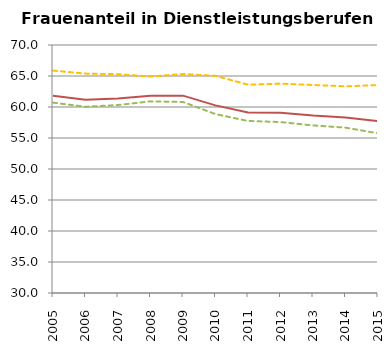
| Category | Produktionsberufe | Dienstleistungsberufe | davon: primäre DL-Berufe | davon: sekundäre DL-Berufe |
|---|---|---|---|---|
| 2005 | 6.493 | 61.829 | 60.706 | 65.877 |
| 2006 | 6.645 | 61.18 | 60.041 | 65.386 |
| 2007 | 6.909 | 61.376 | 60.319 | 65.294 |
| 2008 | 7.366 | 61.8 | 60.908 | 64.917 |
| 2009 | 7.512 | 61.83 | 60.813 | 65.317 |
| 2010 | 7.258 | 60.258 | 58.853 | 65.035 |
| 2011 | 7.058 | 59.114 | 57.747 | 63.604 |
| 2012 | 7.47 | 59.064 | 57.572 | 63.771 |
| 2013 | 7.544 | 58.624 | 57.03 | 63.551 |
| 2014 | 7.908 | 58.32 | 56.67 | 63.336 |
| 2015 | 7.991 | 57.719 | 55.758 | 63.53 |